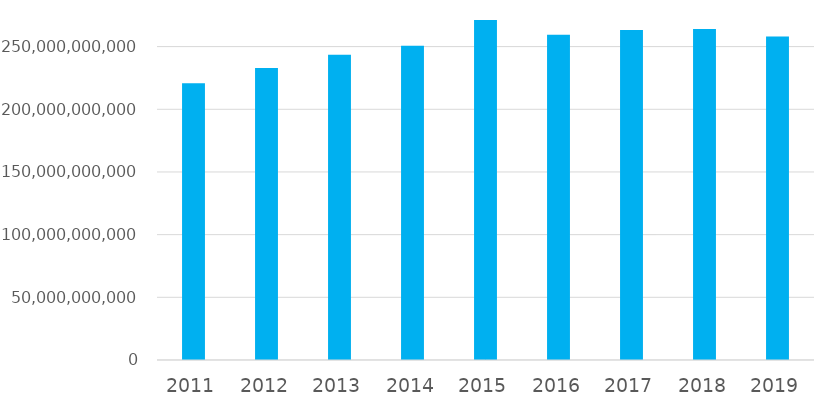
| Category | Totale complessivo |
|---|---|
| 2011.0 | 220795252010.11 |
| 2012.0 | 232963931821.46 |
| 2013.0 | 243493252329.23 |
| 2014.0 | 250612035208.83 |
| 2015.0 | 271212685636.7 |
| 2016.0 | 259495493522.17 |
| 2017.0 | 263215443263.94 |
| 2018.0 | 264040942288.39 |
| 2019.0 | 258113204982.91 |